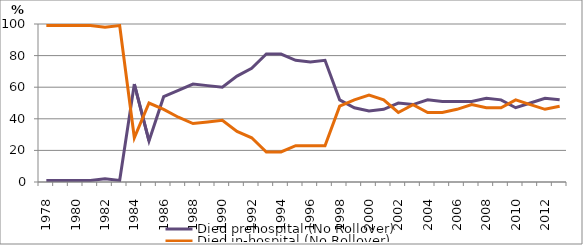
| Category | Died prehospital (No Rollover) | Died in-hospital (No Rollover) |
|---|---|---|
| 1978.0 | 1 | 99 |
| 1979.0 | 1 | 99 |
| 1980.0 | 1 | 99 |
| 1981.0 | 1 | 99 |
| 1982.0 | 2 | 98 |
| 1983.0 | 1 | 99 |
| 1984.0 | 62 | 28 |
| 1985.0 | 26 | 50 |
| 1986.0 | 54 | 46 |
| 1987.0 | 58 | 41 |
| 1988.0 | 62 | 37 |
| 1989.0 | 61 | 38 |
| 1990.0 | 60 | 39 |
| 1991.0 | 67 | 32 |
| 1992.0 | 72 | 28 |
| 1993.0 | 81 | 19 |
| 1994.0 | 81 | 19 |
| 1995.0 | 77 | 23 |
| 1996.0 | 76 | 23 |
| 1997.0 | 77 | 23 |
| 1998.0 | 52 | 48 |
| 1999.0 | 47 | 52 |
| 2000.0 | 45 | 55 |
| 2001.0 | 46 | 52 |
| 2002.0 | 50 | 44 |
| 2003.0 | 49 | 49 |
| 2004.0 | 52 | 44 |
| 2005.0 | 51 | 44 |
| 2006.0 | 51 | 46 |
| 2007.0 | 51 | 49 |
| 2008.0 | 53 | 47 |
| 2009.0 | 52 | 47 |
| 2010.0 | 47 | 52 |
| 2011.0 | 50 | 49 |
| 2012.0 | 53 | 46 |
| 2013.0 | 52 | 48 |